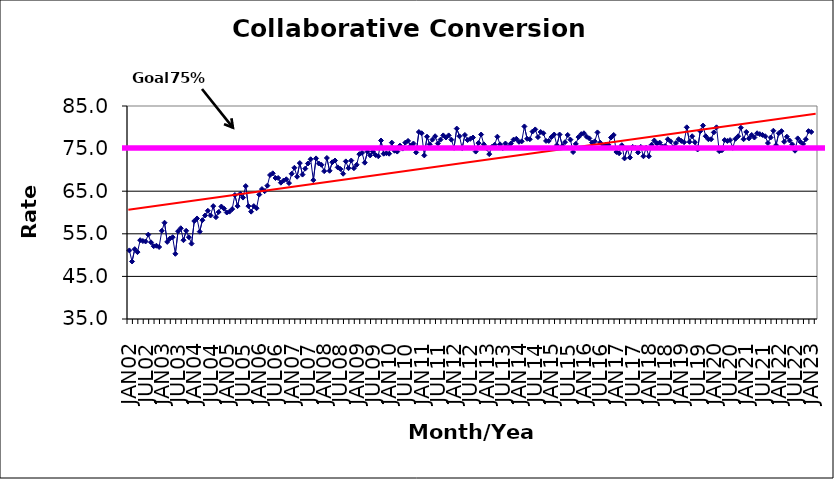
| Category | Series 0 |
|---|---|
| JAN02 | 51.1 |
| FEB02 | 48.5 |
| MAR02 | 51.4 |
| APR02 | 50.7 |
| MAY02 | 53.5 |
| JUN02 | 53.3 |
| JUL02 | 53.2 |
| AUG02 | 54.8 |
| SEP02 | 53 |
| OCT02 | 52.1 |
| NOV02 | 52.2 |
| DEC02 | 51.9 |
| JAN03 | 55.7 |
| FEB03 | 57.6 |
| MAR03 | 53.1 |
| APR03 | 53.9 |
| MAY03 | 54.2 |
| JUN03 | 50.3 |
| JUL03 | 55.6 |
| AUG03 | 56.3 |
| SEP03 | 53.5 |
| OCT03 | 55.7 |
| NOV03 | 54.2 |
| DEC03 | 52.7 |
| JAN04 | 58 |
| FEB04 | 58.6 |
| MAR04 | 55.5 |
| APR04 | 58.2 |
| MAY04 | 59.3 |
| JUN04 | 60.4 |
| JUL04 | 59.3 |
| AUG04 | 61.5 |
| SEP04 | 58.9 |
| OCT04 | 60.1 |
| NOV04 | 61.4 |
| DEC04 | 60.9 |
| JAN05 | 60 |
| FEB05 | 60.2 |
| MAR05 | 60.8 |
| APR05 | 64.1 |
| MAY05 | 61.5 |
| JUN05 | 64.4 |
| JUL05 | 63.5 |
| AUG05 | 66.2 |
| SEP05 | 61.5 |
| OCT05 | 60.2 |
| NOV05 | 61.5 |
| DEC05 | 61 |
| JAN06 | 64.2 |
| FEB06 | 65.5 |
| MAR06 | 65 |
| APR06 | 66.3 |
| MAY06 | 68.8 |
| JUN06 | 69.2 |
| JUL06 | 68.1 |
| AUG06 | 68.1 |
| SEP06 | 67 |
| OCT06 | 67.5 |
| NOV06 | 67.8 |
| DEC06 | 66.9 |
| JAN07 | 69.1 |
| FEB07 | 70.5 |
| MAR07 | 68.4 |
| APR07 | 71.6 |
| MAY07 | 68.9 |
| JUN07 | 70.3 |
| JUL07 | 71.5 |
| AUG07 | 72.5 |
| SEP07 | 67.6 |
| OCT07 | 72.7 |
| NOV07 | 71.5 |
| DEC07 | 71.2 |
| JAN08 | 69.7 |
| FEB08 | 72.8 |
| MAR08 | 69.8 |
| APR08 | 71.8 |
| MAY08 | 72.2 |
| JUN08 | 70.6 |
| JUL08 | 70.2 |
| AUG08 | 69.1 |
| SEP08 | 72 |
| OCT08 | 70.4 |
| NOV08 | 72.2 |
| DEC08 | 70.4 |
| JAN09 | 71.2 |
| FEB09 | 73.7 |
| MAR09 | 74 |
| APR09 | 71.7 |
| MAY09 | 74.3 |
| JUN09 | 73.4 |
| JUL09 | 74.3 |
| AUG09 | 73.5 |
| SEP09 | 73.2 |
| OCT09 | 76.9 |
| NOV09 | 73.8 |
| DEC09 | 73.9 |
| JAN10 | 73.8 |
| FEB10 | 76.4 |
| MAR10 | 74.5 |
| APR10 | 74.3 |
| MAY10 | 75.7 |
| JUN10 | 75 |
| JUL10 | 76.4 |
| AUG10 | 76.8 |
| SEP10 | 75.7 |
| OCT10 | 76.2 |
| NOV10 | 74.1 |
| DEC10 | 78.9 |
| JAN11 | 78.6 |
| FEB11 | 73.4 |
| MAR11 | 77.8 |
| APR11 | 76 |
| MAY11 | 77.1 |
| JUN11 | 77.9 |
| JUL11 | 76.2 |
| AUG11 | 77.1 |
| SEP11 | 78.1 |
| OCT11 | 77.6 |
| NOV11 | 78.1 |
| DEC11 | 77.1 |
| JAN12 | 75.2 |
| FEB12 | 79.7 |
| MAR12 | 77.9 |
| APR12 | 75.1 |
| MAY12 | 78.2 |
| JUN12 | 77 |
| JUL12 | 77.3 |
| AUG12 | 77.6 |
| SEP12 | 74.3 |
| OCT12 | 76.3 |
| NOV12 | 78.3 |
| DEC12 | 76 |
| JAN13 | 75.1 |
| FEB13 | 73.7 |
| MAR13 | 75.4 |
| APR13 | 75.9 |
| MAY13 | 77.8 |
| JUN13 | 76 |
| JUL13 | 75.1 |
| AUG13 | 76.2 |
| SEP13 | 75.4 |
| OCT13 | 76.2 |
| NOV13 | 77.1 |
| DEC13 | 77.3 |
| JAN14 | 76.6 |
| FEB14 | 76.7 |
| MAR14 | 80.2 |
| APR14 | 77.3 |
| MAY14 | 77.2 |
| JUN14 | 79 |
| JUL14 | 79.5 |
| AUG14 | 77.7 |
| SEP14 | 78.9 |
| OCT14 | 78.6 |
| NOV14 | 76.8 |
| DEC14 | 76.8 |
| JAN15 | 77.7 |
| FEB15 | 78.3 |
| MAR15 | 75.8 |
| APR15 | 78.3 |
| MAY15 | 75.6 |
| JUN15 | 76.5 |
| JUL15 | 78.2 |
| AUG15 | 77.1 |
| SEP15 | 74.2 |
| OCT15 | 76.1 |
| NOV15 | 77.7 |
| DEC15 | 78.4 |
| JAN16 | 78.6 |
| FEB16 | 77.8 |
| MAR16 | 77.4 |
| APR16 | 76.4 |
| MAY16 | 76.7 |
| JUN16 | 78.8 |
| JUL16 | 76.4 |
| AUG16 | 75.5 |
| SEP16 | 75.9 |
| OCT16 | 75.9 |
| NOV16 | 77.6 |
| DEC16 | 78.2 |
| JAN17 | 74.2 |
| FEB17 | 73.9 |
| MAR17 | 75.8 |
| APR17 | 72.7 |
| MAY17 | 75 |
| JUN17 | 72.9 |
| JUL17 | 75.4 |
| AUG17 | 75.2 |
| SEP17 | 74.1 |
| OCT17 | 75.4 |
| NOV17 | 73.2 |
| DEC17 | 75.2 |
| JAN18 | 73.2 |
| FEB18 | 75.9 |
| MAR18 | 76.9 |
| APR18 | 76.2 |
| MAY18 | 76.4 |
| JUN18 | 75.5 |
| JUL18 | 75.6 |
| AUG18 | 77.2 |
| SEP18 | 76.7 |
| OCT18 | 75.3 |
| NOV18 | 76.3 |
| DEC18 | 77.2 |
| JAN19 | 76.8 |
| FEB19 | 76.5 |
| MAR19 | 80 |
| APR19 | 76.6 |
| MAY19 | 77.9 |
| JUN19 | 76.5 |
| JUL19 | 74.8 |
| AUG19 | 79.1 |
| SEP19 | 80.4 |
| OCT19 | 77.9 |
| NOV19 | 77.2 |
| DEC19 | 77.2 |
| JAN20 | 78.8 |
| FEB20 | 80 |
| MAR20 | 74.4 |
| APR20 | 74.6 |
| MAY20 | 77 |
| JUN20 | 76.8 |
| JUL20 | 77 |
| AUG20 | 75.2 |
| SEP20 | 77.3 |
| OCT20 | 77.9 |
| NOV20 | 79.9 |
| DEC20 | 77.2 |
| JAN21 | 78.9 |
| FEB21 | 77.4 |
| MAR21 | 78.2 |
| APR21 | 77.6 |
| MAY21 | 78.6 |
| JUN21 | 78.4 |
| JUL21 | 78.2 |
| AUG21 | 77.9 |
| SEP21 | 76.3 |
| OCT21 | 77.6 |
| NOV21 | 79.2 |
| DEC21 | 75.8 |
| JAN22 | 78.6 |
| FEB22 | 79.1 |
| MAR22 | 76.6 |
| APR22 | 77.8 |
| MAY22 | 76.9 |
| JUN22 | 76 |
| JUL22 | 74.5 |
| AUG22 | 77.4 |
| SEP22 | 76.6 |
| OCT22 | 76.1 |
| NOV22 | 77.2 |
| DEC22 | 79.1 |
| JAN23 | 78.9 |